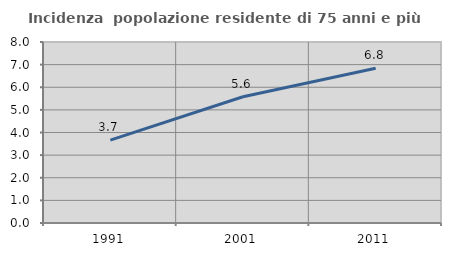
| Category | Incidenza  popolazione residente di 75 anni e più |
|---|---|
| 1991.0 | 3.664 |
| 2001.0 | 5.581 |
| 2011.0 | 6.842 |